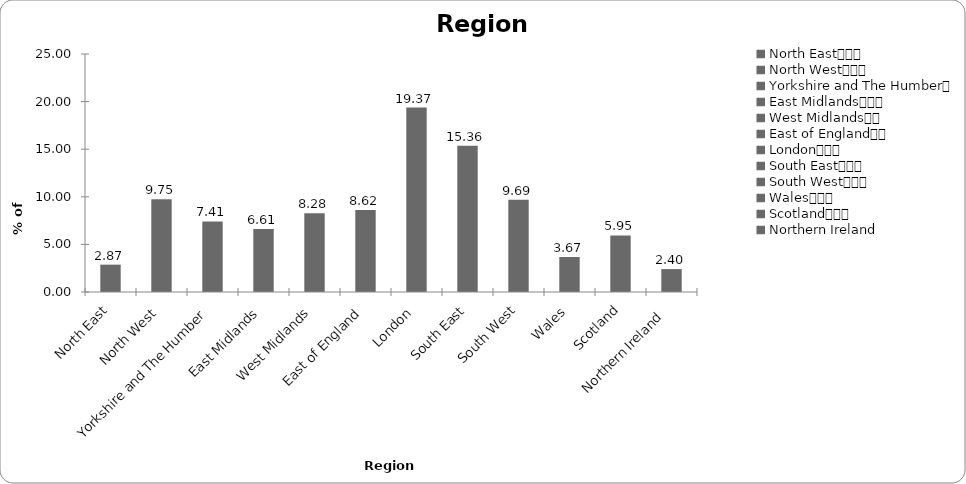
| Category | Region |
|---|---|
| North East			 | 2.872 |
| North West			 | 9.753 |
| Yorkshire and The Humber	 | 7.415 |
| East Midlands			 | 6.613 |
| West Midlands		 | 8.283 |
| East of England		 | 8.617 |
| London			 | 19.372 |
| South East			 | 15.364 |
| South West			 | 9.686 |
| Wales			 | 3.674 |
| Scotland			 | 5.945 |
| Northern Ireland  | 2.405 |